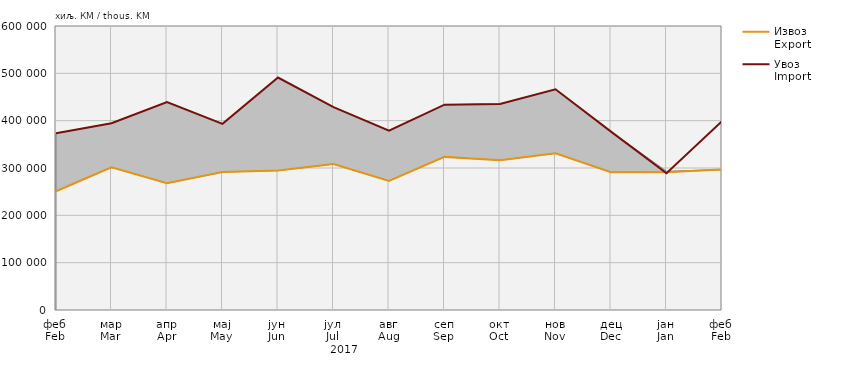
| Category | Извоз
Export | Увоз
Import |
|---|---|---|
| феб
Feb | 250969 | 373425 |
| мар
Mar | 301409 | 394461 |
| апр
Apr | 267973 | 439231 |
| мај
May | 291490 | 393257 |
| јун
Jun | 294506 | 491152 |
| јул
Jul | 308275 | 428722 |
| авг
Aug | 272830 | 378735 |
| сеп
Sep | 323479 | 433731 |
| окт
Oct | 316474 | 435293 |
| нов
Nov | 330900 | 466301 |
| дец
Dec | 291210 | 376925 |
| јан
Jan | 291118 | 288860 |
| феб
Feb | 296672 | 399118 |